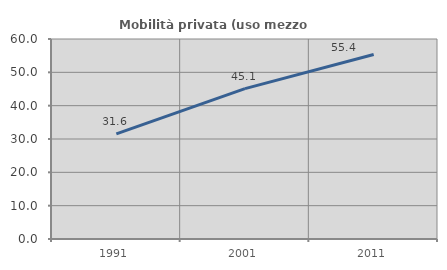
| Category | Mobilità privata (uso mezzo privato) |
|---|---|
| 1991.0 | 31.556 |
| 2001.0 | 45.101 |
| 2011.0 | 55.37 |